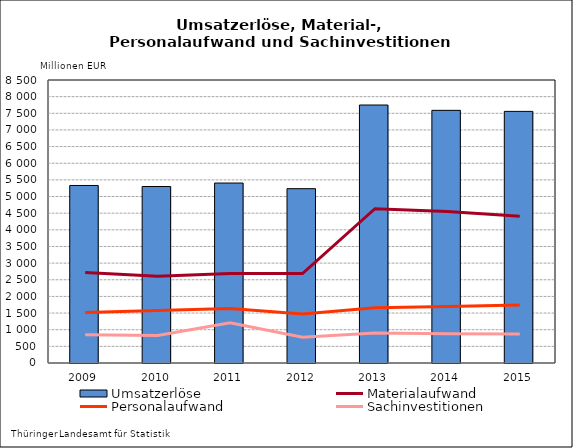
| Category | Umsatzerlöse |
|---|---|
| 2009.0 | 5332 |
| 2010.0 | 5301 |
| 2011.0 | 5405 |
| 2012.0 | 5236 |
| 2013.0 | 7748.836 |
| 2014.0 | 7588.59 |
| 2015.0 | 7557.268 |